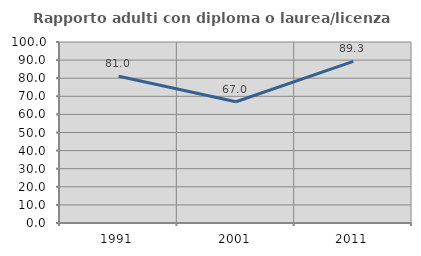
| Category | Rapporto adulti con diploma o laurea/licenza media  |
|---|---|
| 1991.0 | 81.034 |
| 2001.0 | 66.981 |
| 2011.0 | 89.313 |